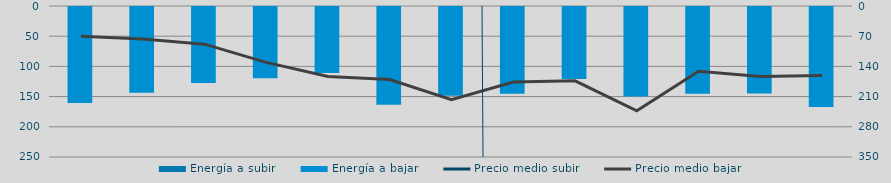
| Category | Energía a subir | Energía a bajar |
|---|---|---|
| J |  | 160.578 |
| J |  | 143.66 |
| A |  | 127.341 |
| S |  | 119.623 |
| O |  | 110.774 |
| N |  | 163.48 |
| D |  | 148.636 |
| E |  | 145.389 |
| F |  | 120.749 |
| M |  | 149.634 |
| A |  | 145.138 |
| M |  | 144.774 |
| J |  | 167.273 |